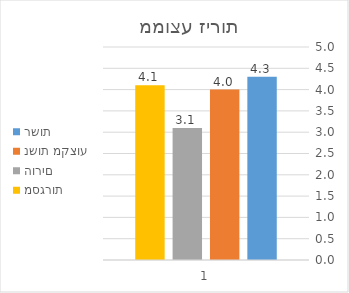
| Category | רשות | נשות מקצוע | הורים | מסגרות |
|---|---|---|---|---|
| 0 | 4.304 | 4 | 3.1 | 4.1 |